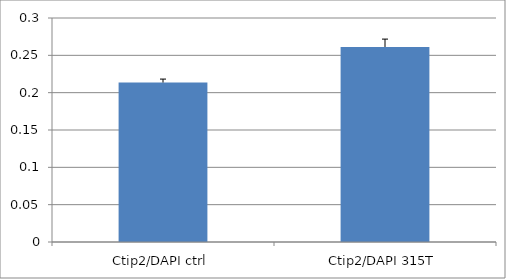
| Category | Series 0 |
|---|---|
| Ctip2/DAPI ctrl | 0.214 |
| Ctip2/DAPI 315T | 0.261 |